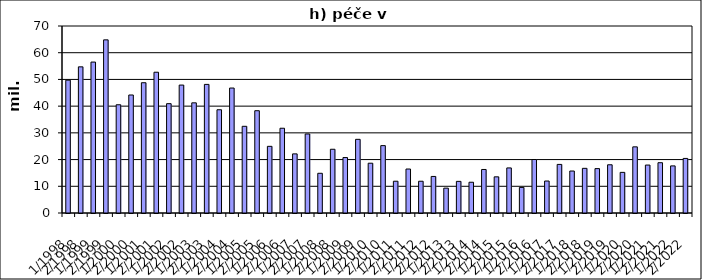
| Category | Series 0 |
|---|---|
| 1/1998 | 49724.254 |
| 2/1998 | 54710.746 |
| 1/1999 | 56499.941 |
| 2/1999 | 64809.059 |
| 1/2000 | 40521.101 |
| 2/2000 | 44172.899 |
| 1/2001 | 48766.508 |
| 2/2001 | 52697.871 |
| 1/2002 | 40926 |
| 2/2002 | 47887 |
| 1/2003 | 41239 |
| 2/2003 | 48142.441 |
| 1/2004 | 38646.413 |
| 2/2004 | 46777.432 |
| 1/2005 | 32454 |
| 2/2005 | 38289.082 |
| 1/2006 | 24952 |
| 2/2006 | 31726 |
| 1/2007 | 22129 |
| 2/2007 | 29583 |
| 1/2008 | 14865.507 |
| 2/2008 | 23863.493 |
| 1/2009 | 20755.827 |
| 2/2009 | 27574 |
| 1/2010 | 18636 |
| 2/2010 | 25221 |
| 1/2011 | 11894 |
| 2/2011 | 16462 |
| 1/2012 | 11886 |
| 2/2012 | 13684 |
| 1/2013 | 9308 |
| 2/2013 | 11841 |
| 1/2014 | 11516 |
| 2/2014 | 16291 |
| 1/2015 | 13537 |
| 2/2015 | 16872 |
| 1/2016 | 9573 |
| 2/2016 | 20018 |
| 1/2017 | 11972 |
| 2/2017 | 18190 |
| 1/2018 | 15715.84 |
| 2/2018 | 16717.126 |
| 1/2019 | 16615.78 |
| 2/2019 | 18050.556 |
| 1/2020 | 15209.806 |
| 2/2020 | 24762.194 |
| 1/2021 | 17949.66 |
| 2/2021 | 18821.944 |
| 1/2022 | 17632.33 |
| 2/2022 | 20425.009 |